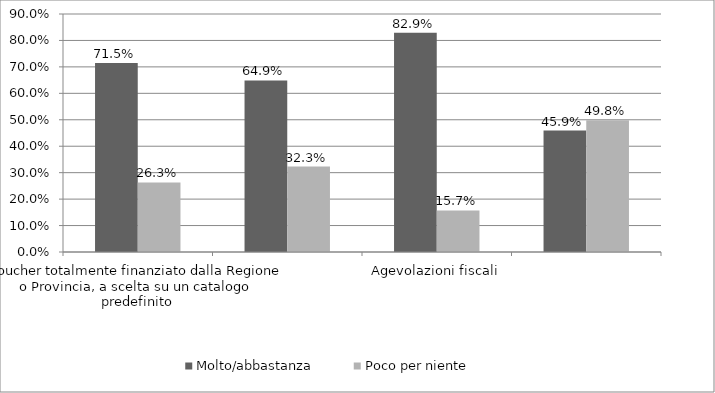
| Category | Molto/abbastanza | Poco per niente |
|---|---|---|
| Voucher totalmente finanziato dalla Regione o Provincia, a scelta su un catalogo predefinito | 0.715 | 0.263 |
| Voucher parzialmente finanziato dalla Regione o Provincia,  a libera scelta sul mercato | 0.649 | 0.323 |
| Agevolazioni fiscali | 0.829 | 0.157 |
| Accantonare in percentuale al proprio reddito una contribuzione finalizzata alla formazione | 0.459 | 0.498 |